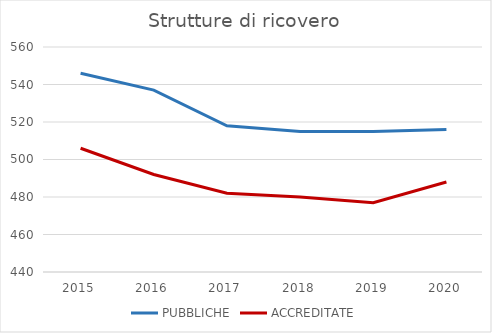
| Category | PUBBLICHE | ACCREDITATE |
|---|---|---|
| 2015.0 | 546 | 506 |
| 2016.0 | 537 | 492 |
| 2017.0 | 518 | 482 |
| 2018.0 | 515 | 480 |
| 2019.0 | 515 | 477 |
| 2020.0 | 516 | 488 |